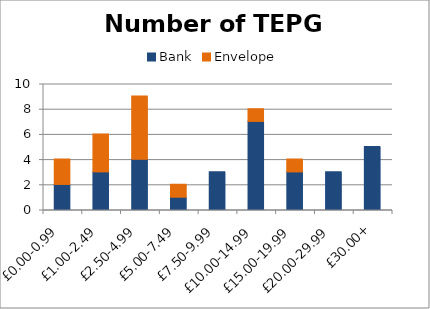
| Category | Bank | Envelope |
|---|---|---|
| £0.00-0.99 | 2 | 2 |
| £1.00-2.49 | 3 | 3 |
| £2.50-4.99 | 4 | 5 |
| £5.00-7.49 | 1 | 1 |
| £7.50-9.99 | 3 | 0 |
| £10.00-14.99 | 7 | 1 |
| £15.00-19.99 | 3 | 1 |
| £20.00-29.99 | 3 | 0 |
| £30.00+ | 5 | 0 |